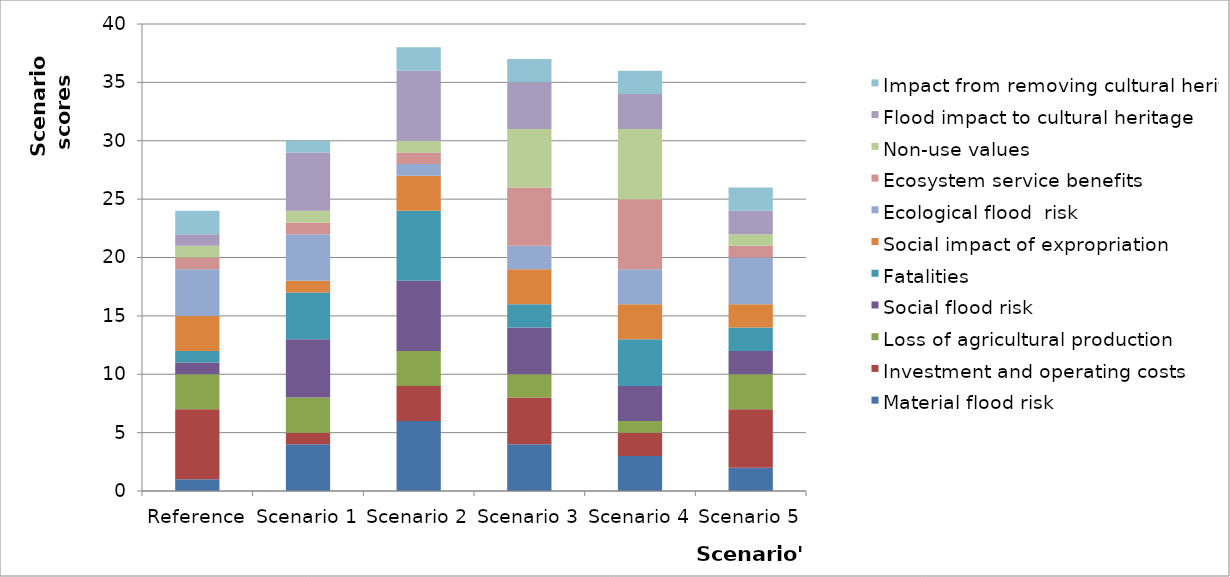
| Category | Material flood risk | Investment and operating costs | Loss of agricultural production  | Social flood risk | Fatalities | Social impact of expropriation | Ecological flood  risk | Ecosystem service benefits | Non-use values | Flood impact to cultural heritage | Impact from removing cultural heritage |
|---|---|---|---|---|---|---|---|---|---|---|---|
| Reference | 1 | 6 | 3 | 1 | 1 | 3 | 4 | 1 | 1 | 1 | 2 |
| Scenario 1 | 4 | 1 | 3 | 5 | 4 | 1 | 4 | 1 | 1 | 5 | 1 |
| Scenario 2 | 6 | 3 | 3 | 6 | 6 | 3 | 1 | 1 | 1 | 6 | 2 |
| Scenario 3 | 4 | 4 | 2 | 4 | 2 | 3 | 2 | 5 | 5 | 4 | 2 |
| Scenario 4 | 3 | 2 | 1 | 3 | 4 | 3 | 3 | 6 | 6 | 3 | 2 |
| Scenario 5 | 2 | 5 | 3 | 2 | 2 | 2 | 4 | 1 | 1 | 2 | 2 |